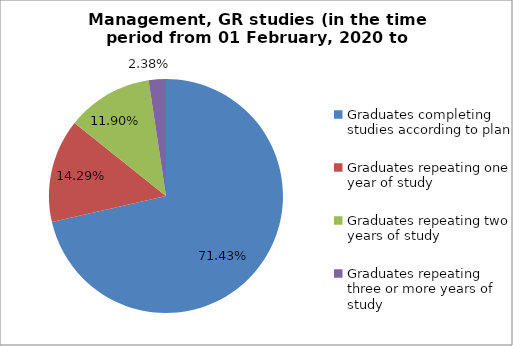
| Category | Series 0 |
|---|---|
| Graduates completing studies according to plan | 71.429 |
| Graduates repeating one year of study | 14.286 |
| Graduates repeating two years of study | 11.905 |
| Graduates repeating three or more years of study | 2.381 |